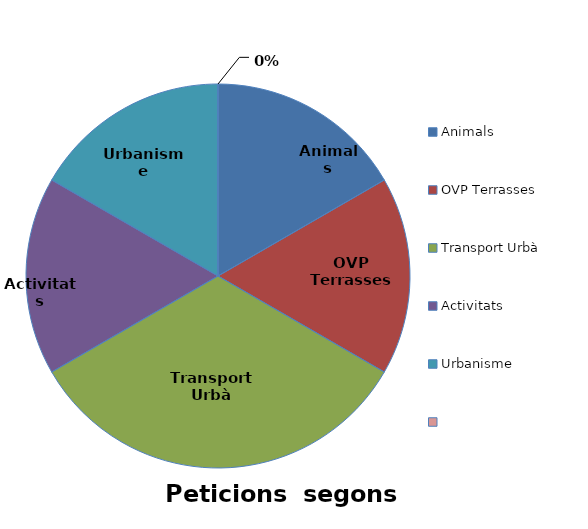
| Category | Series 0 |
|---|---|
| Animals | 0.167 |
| OVP Terrasses | 0.167 |
| Transport Urbà | 0.333 |
| Activitats | 0.167 |
| Urbanisme | 0.167 |